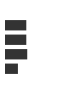
| Category | Series 0 |
|---|---|
| 0 | 0.286 |
| 1 | 0.286 |
| 2 | 0.299 |
| 3 | 0.168 |